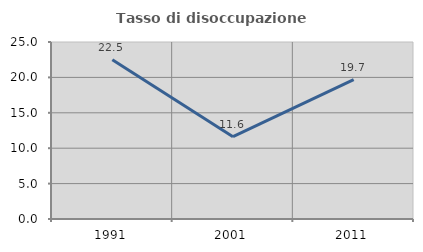
| Category | Tasso di disoccupazione giovanile  |
|---|---|
| 1991.0 | 22.485 |
| 2001.0 | 11.628 |
| 2011.0 | 19.697 |